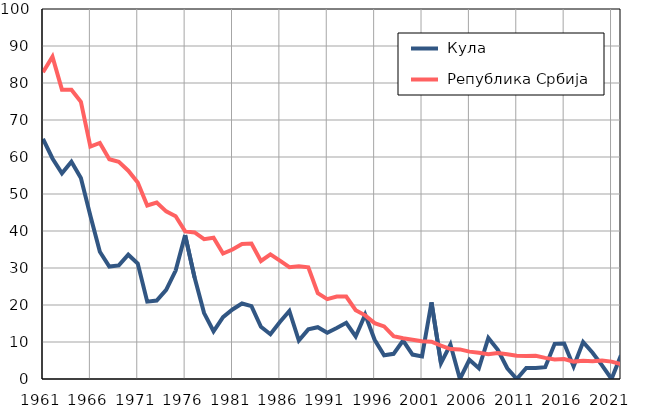
| Category |  Кула |  Република Србија |
|---|---|---|
| 1961.0 | 64.9 | 82.9 |
| 1962.0 | 59.6 | 87.1 |
| 1963.0 | 55.6 | 78.2 |
| 1964.0 | 58.7 | 78.2 |
| 1965.0 | 54.3 | 74.9 |
| 1966.0 | 44.1 | 62.8 |
| 1967.0 | 34.4 | 63.8 |
| 1968.0 | 30.4 | 59.4 |
| 1969.0 | 30.7 | 58.7 |
| 1970.0 | 33.6 | 56.3 |
| 1971.0 | 31.2 | 53.1 |
| 1972.0 | 20.9 | 46.9 |
| 1973.0 | 21.2 | 47.7 |
| 1974.0 | 24.1 | 45.3 |
| 1975.0 | 29.3 | 44 |
| 1976.0 | 38.9 | 39.9 |
| 1977.0 | 27.4 | 39.6 |
| 1978.0 | 17.8 | 37.8 |
| 1979.0 | 12.9 | 38.2 |
| 1980.0 | 16.7 | 33.9 |
| 1981.0 | 18.8 | 35 |
| 1982.0 | 20.4 | 36.5 |
| 1983.0 | 19.7 | 36.6 |
| 1984.0 | 14.1 | 31.9 |
| 1985.0 | 12.1 | 33.7 |
| 1986.0 | 15.4 | 32 |
| 1987.0 | 18.4 | 30.2 |
| 1988.0 | 10.4 | 30.5 |
| 1989.0 | 13.4 | 30.2 |
| 1990.0 | 14 | 23.2 |
| 1991.0 | 12.5 | 21.6 |
| 1992.0 | 13.8 | 22.3 |
| 1993.0 | 15.2 | 22.3 |
| 1994.0 | 11.5 | 18.6 |
| 1995.0 | 17.4 | 17.2 |
| 1996.0 | 10.6 | 15.1 |
| 1997.0 | 6.4 | 14.2 |
| 1998.0 | 6.8 | 11.6 |
| 1999.0 | 10.4 | 11 |
| 2000.0 | 6.6 | 10.6 |
| 2001.0 | 6.1 | 10.2 |
| 2002.0 | 20.7 | 10.1 |
| 2003.0 | 4.3 | 9 |
| 2004.0 | 9.3 | 8.1 |
| 2005.0 | 0 | 8 |
| 2006.0 | 5.2 | 7.4 |
| 2007.0 | 2.9 | 7.1 |
| 2008.0 | 11.1 | 6.7 |
| 2009.0 | 7.9 | 7 |
| 2010.0 | 2.9 | 6.7 |
| 2011.0 | 0 | 6.3 |
| 2012.0 | 3 | 6.2 |
| 2013.0 | 3 | 6.3 |
| 2014.0 | 3.2 | 5.7 |
| 2015.0 | 9.5 | 5.3 |
| 2016.0 | 9.6 | 5.4 |
| 2017.0 | 3.4 | 4.7 |
| 2018.0 | 10 | 4.9 |
| 2019.0 | 7.1 | 4.8 |
| 2020.0 | 3.7 | 5 |
| 2021.0 | 0 | 4.7 |
| 2022.0 | 6.4 | 4 |